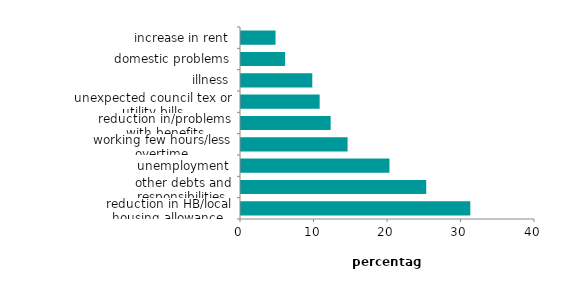
| Category | Series 0 | Series 1 |
|---|---|---|
| reduction in HB/local housing allowance | 31.2 |  |
| other debts and responsibilities | 25.2 |  |
| unemployment | 20.2 |  |
| working few hours/less overtime | 14.5 |  |
| reduction in/problems with benefits | 12.2 |  |
| unexpected council tex or utility bills | 10.7 |  |
| illness | 9.7 |  |
| domestic problems | 6 |  |
| increase in rent | 4.7 |  |